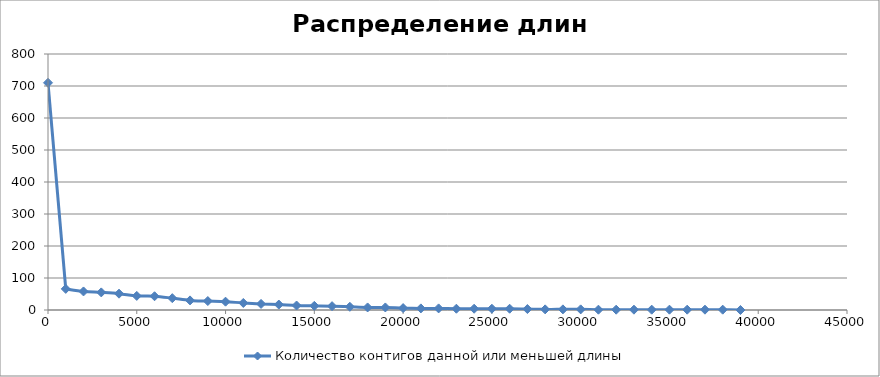
| Category | Количество контигов данной или меньшей длины |
|---|---|
| 39000.0 | 0 |
| 38000.0 | 1 |
| 37000.0 | 1 |
| 36000.0 | 1 |
| 35000.0 | 1 |
| 34000.0 | 1 |
| 33000.0 | 1 |
| 32000.0 | 1 |
| 31000.0 | 1 |
| 30000.0 | 2 |
| 29000.0 | 2 |
| 28000.0 | 2 |
| 27000.0 | 3 |
| 26000.0 | 4 |
| 25000.0 | 4 |
| 24000.0 | 4 |
| 23000.0 | 4 |
| 22000.0 | 5 |
| 21000.0 | 5 |
| 20000.0 | 6 |
| 19000.0 | 8 |
| 18000.0 | 8 |
| 17000.0 | 10 |
| 16000.0 | 12 |
| 15000.0 | 13 |
| 14000.0 | 14 |
| 13000.0 | 17 |
| 12000.0 | 19 |
| 11000.0 | 22 |
| 10000.0 | 26 |
| 9000.0 | 28 |
| 8000.0 | 30 |
| 7000.0 | 37 |
| 6000.0 | 43 |
| 5000.0 | 44 |
| 4000.0 | 51 |
| 3000.0 | 55 |
| 2000.0 | 58 |
| 1000.0 | 66 |
| 0.0 | 710 |